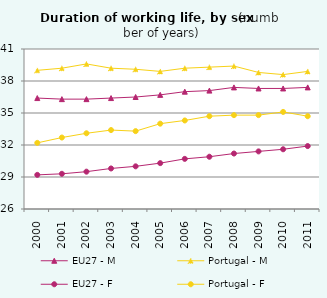
| Category | EU27 - M | Portugal - M | EU27 - F | Portugal - F |
|---|---|---|---|---|
| 2000.0 | 36.4 | 39 | 29.2 | 32.2 |
| 2001.0 | 36.3 | 39.2 | 29.3 | 32.7 |
| 2002.0 | 36.3 | 39.6 | 29.5 | 33.1 |
| 2003.0 | 36.4 | 39.2 | 29.8 | 33.4 |
| 2004.0 | 36.5 | 39.1 | 30 | 33.3 |
| 2005.0 | 36.7 | 38.9 | 30.3 | 34 |
| 2006.0 | 37 | 39.2 | 30.7 | 34.3 |
| 2007.0 | 37.1 | 39.3 | 30.9 | 34.7 |
| 2008.0 | 37.4 | 39.4 | 31.2 | 34.8 |
| 2009.0 | 37.3 | 38.8 | 31.4 | 34.8 |
| 2010.0 | 37.3 | 38.6 | 31.6 | 35.1 |
| 2011.0 | 37.4 | 38.9 | 31.9 | 34.7 |